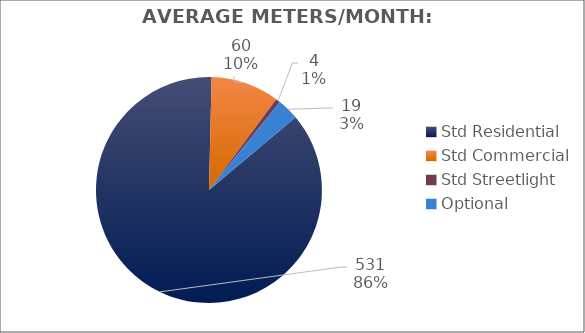
| Category | Meters |
|---|---|
| Std Residential | 531 |
| Std Commercial | 60 |
| Std Streetlight | 4 |
| Optional | 19 |